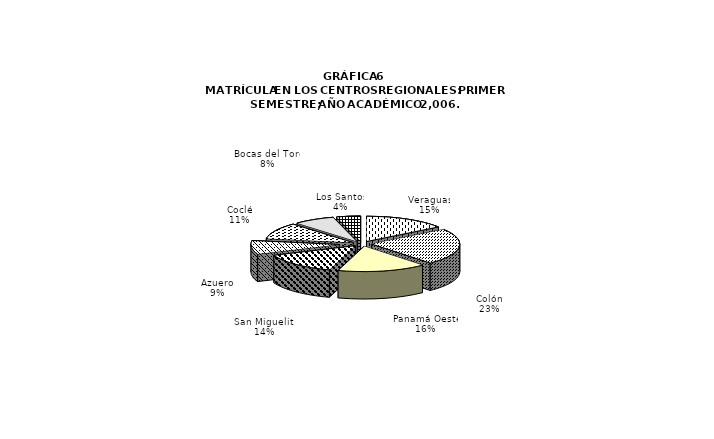
| Category | Series 0 |
|---|---|
| Veraguas | 4385 |
| Colón | 6689 |
| Panamá Oeste | 4703 |
| San Miguelito | 4044 |
| Azuero | 2515 |
| Coclé | 3033 |
| Bocas del Toro | 2180 |
| Los Santos | 1263 |